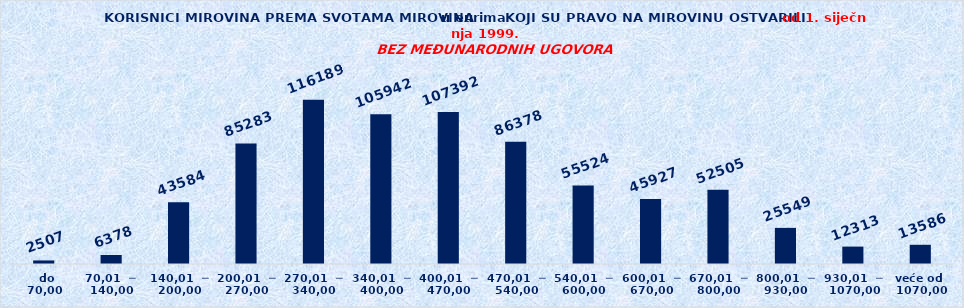
| Category | Series 0 |
|---|---|
|   do  70,00 | 2507 |
| 70,01  ─  140,00 | 6378 |
| 140,01  ─  200,00 | 43584 |
| 200,01  ─  270,00 | 85283 |
| 270,01  ─  340,00 | 116189 |
| 340,01  ─  400,00 | 105942 |
| 400,01  ─  470,00 | 107392 |
| 470,01  ─  540,00 | 86378 |
| 540,01  ─  600,00 | 55524 |
| 600,01  ─  670,00 | 45927 |
| 670,01  ─  800,00 | 52505 |
| 800,01  ─  930,00 | 25549 |
| 930,01  ─  1070,00 | 12313 |
| veće od  1070,00 | 13586 |